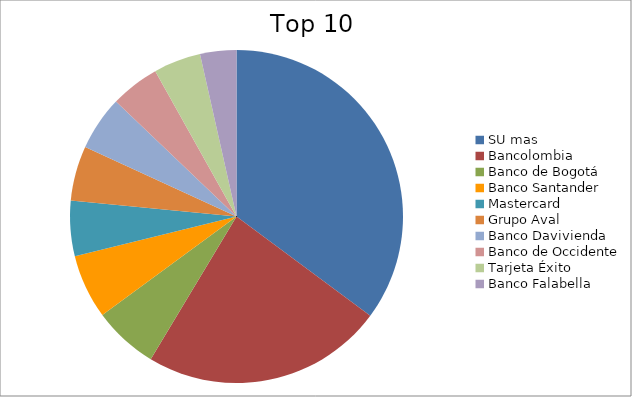
| Category | Series 0 |
|---|---|
| SU mas | 35.15 |
| Bancolombia | 23.46 |
| Banco de Bogotá | 6.3 |
| Banco Santander | 6.24 |
| Mastercard | 5.37 |
| Grupo Aval | 5.32 |
| Banco Davivienda | 5.27 |
| Banco de Occidente | 4.77 |
| Tarjeta Éxito | 4.59 |
| Banco Falabella | 3.52 |